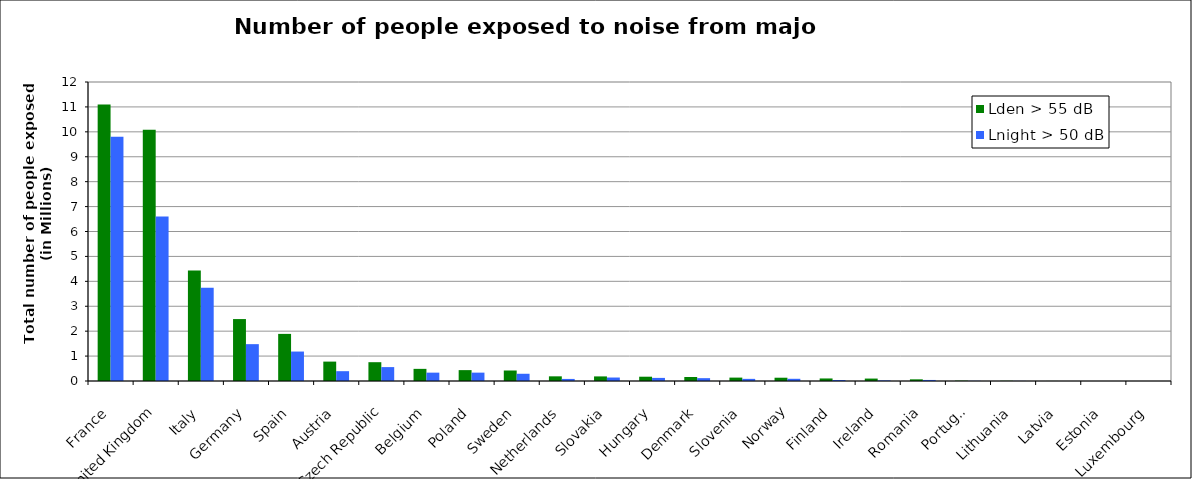
| Category | Lden > 55 dB  | Lnight > 50 dB |
|---|---|---|
| France | 11099200 | 9801000 |
| United Kingdom | 10087000 | 6604900 |
| Italy | 4439400 | 3745200 |
| Germany | 2485500 | 1479100 |
| Spain | 1890800 | 1182000 |
| Austria | 778500 | 394100 |
| Czech Republic | 754800 | 558000 |
| Belgium | 487200 | 335300 |
| Poland | 436700 | 335700 |
| Sweden | 421400 | 290500 |
| Netherlands | 187400 | 83100 |
| Slovakia | 184400 | 139600 |
| Hungary | 172200 | 124300 |
| Denmark | 160300 | 114100 |
| Slovenia | 136300 | 85800 |
| Norway | 131600 | 88700 |
| Finland | 102000 | 39400 |
| Ireland | 97600 | 24000 |
| Romania | 66800 | 42000 |
| Portugal | 13500 | 6900 |
| Lithuania | 7600 | 4000 |
| Latvia | 1500 | 500 |
| Estonia | 200 | 100 |
| Luxembourg | 100 | 0 |